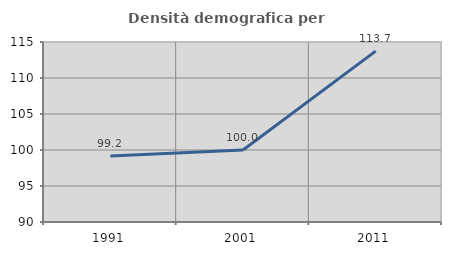
| Category | Densità demografica |
|---|---|
| 1991.0 | 99.176 |
| 2001.0 | 100.008 |
| 2011.0 | 113.733 |